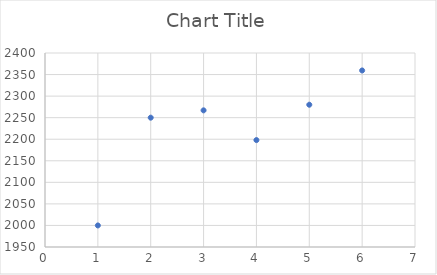
| Category | Series 0 |
|---|---|
| 1.0 | 2000 |
| 2.0 | 2250 |
| 3.0 | 2267 |
| 4.0 | 2198 |
| 5.0 | 2280 |
| 6.0 | 2359.51 |